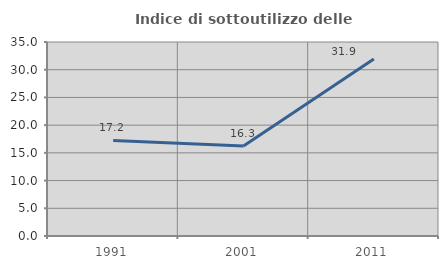
| Category | Indice di sottoutilizzo delle abitazioni  |
|---|---|
| 1991.0 | 17.241 |
| 2001.0 | 16.25 |
| 2011.0 | 31.944 |